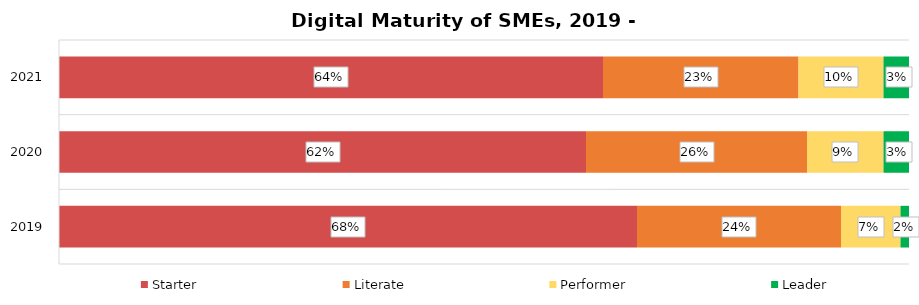
| Category | Starter | Literate | Performer | Leader |
|---|---|---|---|---|
| 2019.0 | 0.68 | 0.24 | 0.07 | 0.02 |
| 2020.0 | 0.62 | 0.26 | 0.09 | 0.03 |
| 2021.0 | 0.64 | 0.23 | 0.1 | 0.03 |